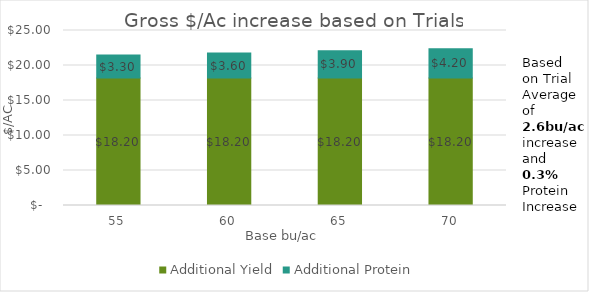
| Category | Additional Yield | Additional Protein |
|---|---|---|
| 55 | 18.2 | 3.3 |
| 60 | 18.2 | 3.6 |
| 65 | 18.2 | 3.9 |
| 70 | 18.2 | 4.2 |